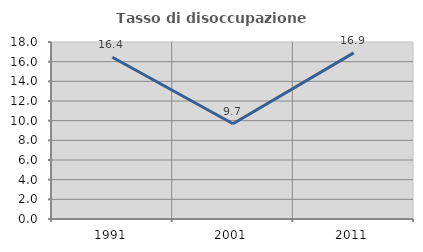
| Category | Tasso di disoccupazione giovanile  |
|---|---|
| 1991.0 | 16.443 |
| 2001.0 | 9.681 |
| 2011.0 | 16.896 |